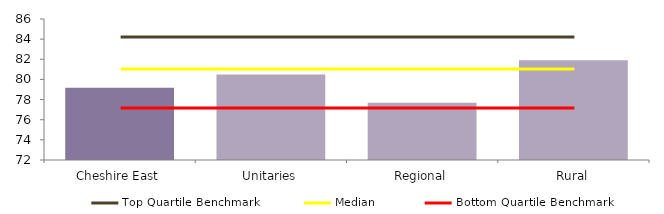
| Category | Block Data |
|---|---|
| Cheshire East | 79.173 |
| Unitaries | 80.498 |
| Regional | 77.675 |
|  Rural  | 81.914 |